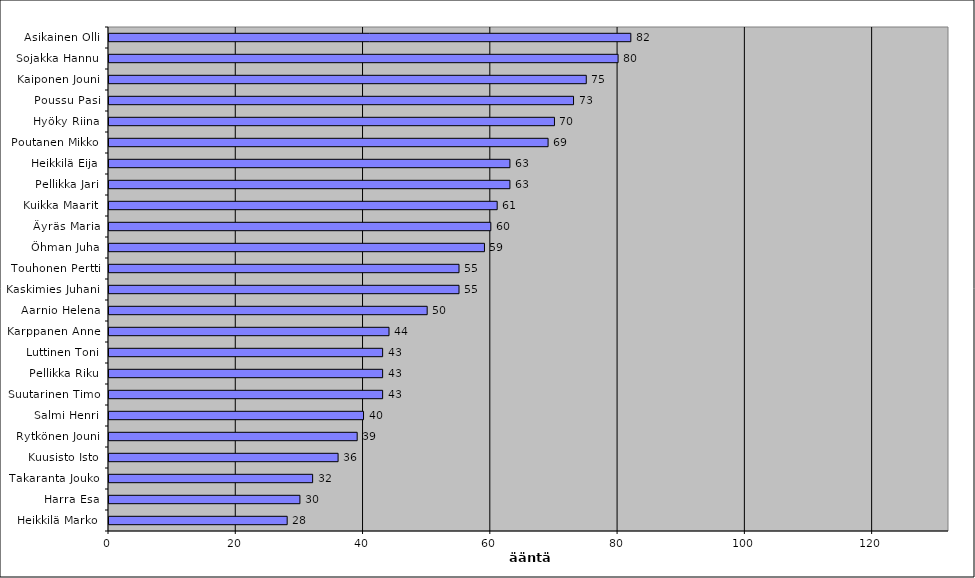
| Category | Series 0 |
|---|---|
| Asikainen Olli | 82 |
| Sojakka Hannu | 80 |
| Kaiponen Jouni | 75 |
| Poussu Pasi | 73 |
| Hyöky Riina | 70 |
| Poutanen Mikko | 69 |
| Heikkilä Eija | 63 |
| Pellikka Jari | 63 |
| Kuikka Maarit | 61 |
| Äyräs Maria | 60 |
| Öhman Juha | 59 |
| Touhonen Pertti | 55 |
| Kaskimies Juhani | 55 |
| Aarnio Helena | 50 |
| Karppanen Anne | 44 |
| Luttinen Toni | 43 |
| Pellikka Riku | 43 |
| Suutarinen Timo | 43 |
| Salmi Henri | 40 |
| Rytkönen Jouni | 39 |
| Kuusisto Isto | 36 |
| Takaranta Jouko | 32 |
| Harra Esa | 30 |
| Heikkilä Marko | 28 |